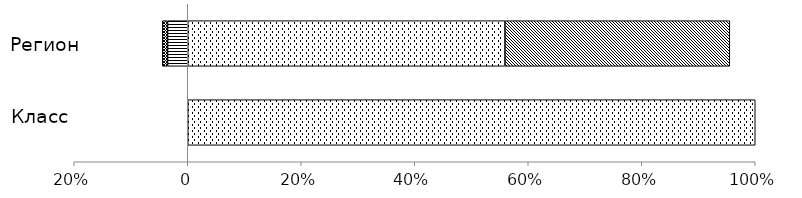
| Category | Пониженный | Недостаточный | Базовый | Повышенный |
|---|---|---|---|---|
|  | 0 | 0 | 1 | 0 |
|  | -0.036 | -0.009 | 0.559 | 0.396 |